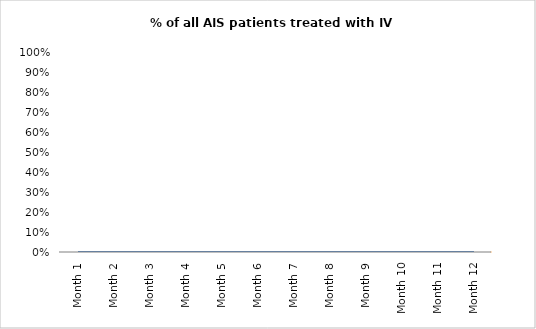
| Category | % of all AIS patients treated with IV Activase |
|---|---|
| Month 1 | 0 |
| Month 2 | 0 |
| Month 3 | 0 |
| Month 4 | 0 |
| Month 5 | 0 |
| Month 6 | 0 |
| Month 7 | 0 |
| Month 8 | 0 |
| Month 9 | 0 |
| Month 10 | 0 |
| Month 11 | 0 |
| Month 12 | 0 |